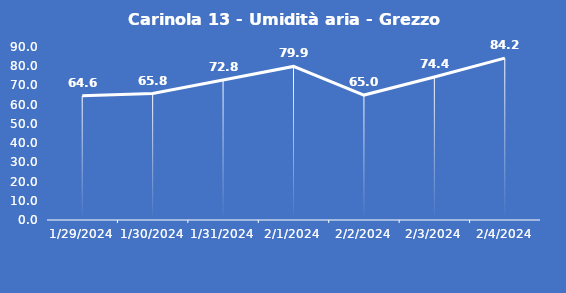
| Category | Carinola 13 - Umidità aria - Grezzo (%) |
|---|---|
| 1/29/24 | 64.6 |
| 1/30/24 | 65.8 |
| 1/31/24 | 72.8 |
| 2/1/24 | 79.9 |
| 2/2/24 | 65 |
| 2/3/24 | 74.4 |
| 2/4/24 | 84.2 |